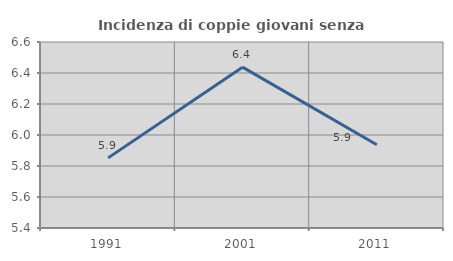
| Category | Incidenza di coppie giovani senza figli |
|---|---|
| 1991.0 | 5.852 |
| 2001.0 | 6.438 |
| 2011.0 | 5.937 |